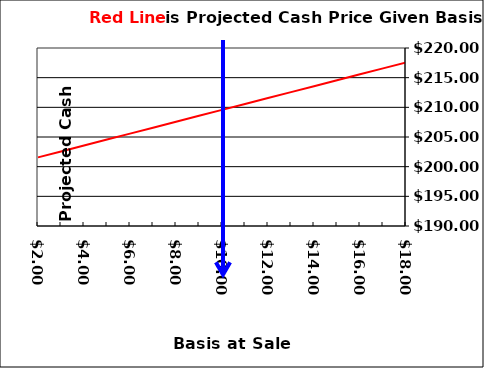
| Category | Projected Cash |
|---|---|
| 2.0 | 201.567 |
| 3.0 | 202.567 |
| 4.0 | 203.567 |
| 5.0 | 204.567 |
| 6.0 | 205.567 |
| 7.0 | 206.567 |
| 8.0 | 207.567 |
| 9.0 | 208.567 |
| 10.0 | 209.567 |
| 11.0 | 210.567 |
| 12.0 | 211.567 |
| 13.0 | 212.567 |
| 14.0 | 213.567 |
| 15.0 | 214.567 |
| 16.0 | 215.567 |
| 17.0 | 216.567 |
| 18.0 | 217.567 |